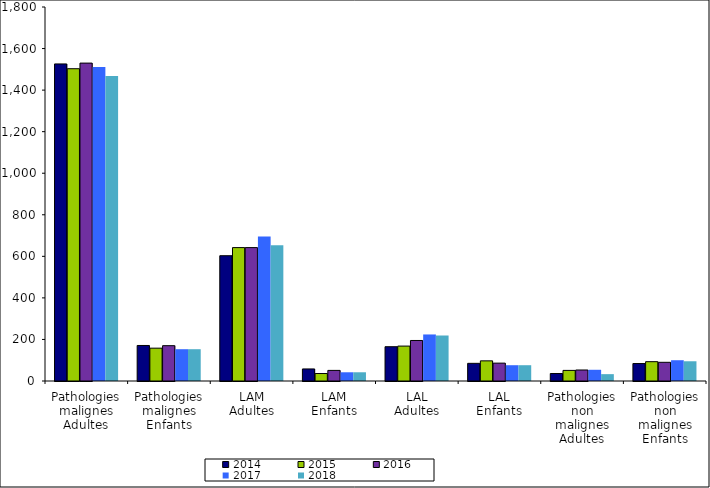
| Category | 2014 | 2015 | 2016 | 2017 | 2018 |
|---|---|---|---|---|---|
| Pathologies malignes
Adultes | 1526 | 1503 | 1530 | 1511 | 1468 |
| Pathologies malignes
Enfants | 171 | 158 | 170 | 153 | 153 |
| LAM
Adultes | 603 | 642 | 642 | 696 | 653 |
| LAM
Enfants | 58 | 36 | 51 | 42 | 42 |
| LAL
Adultes | 165 | 168 | 195 | 224 | 219 |
| LAL
Enfants | 85 | 97 | 86 | 76 | 76 |
| Pathologies non malignes
Adultes | 36 | 51 | 53 | 54 | 33 |
| Pathologies non malignes
Enfants | 84 | 93 | 90 | 100 | 95 |